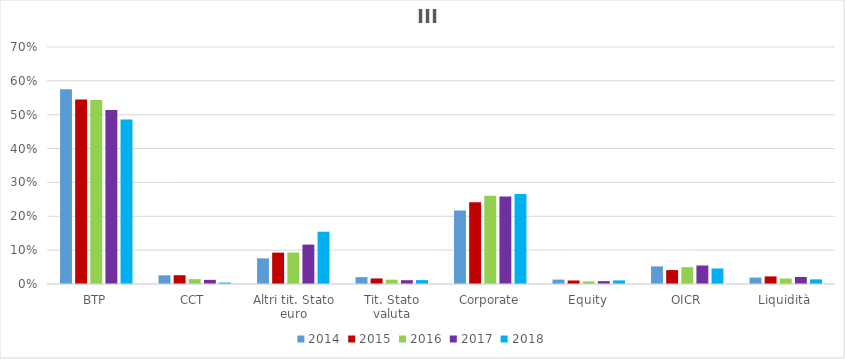
| Category | 2014 | 2015 | 2016 | 2017 | 2018 |
|---|---|---|---|---|---|
| BTP | 0.575 | 0.545 | 0.543 | 0.514 | 0.486 |
| CCT | 0.026 | 0.026 | 0.014 | 0.012 | 0.004 |
| Altri tit. Stato euro | 0.076 | 0.093 | 0.093 | 0.116 | 0.154 |
| Tit. Stato valuta | 0.02 | 0.016 | 0.013 | 0.011 | 0.011 |
| Corporate | 0.217 | 0.241 | 0.261 | 0.258 | 0.266 |
| Equity | 0.013 | 0.01 | 0.007 | 0.008 | 0.011 |
| OICR | 0.052 | 0.041 | 0.05 | 0.055 | 0.046 |
| Liquidità | 0.019 | 0.022 | 0.016 | 0.021 | 0.014 |